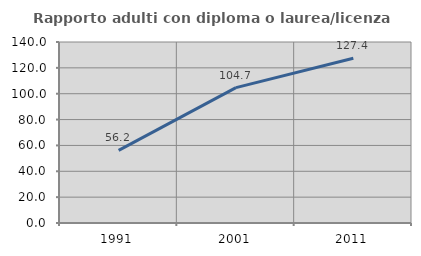
| Category | Rapporto adulti con diploma o laurea/licenza media  |
|---|---|
| 1991.0 | 56.164 |
| 2001.0 | 104.712 |
| 2011.0 | 127.426 |